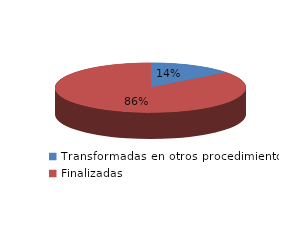
| Category | Series 0 |
|---|---|
| Transformadas en otros procedimientos | 2996 |
| Finalizadas | 17840 |